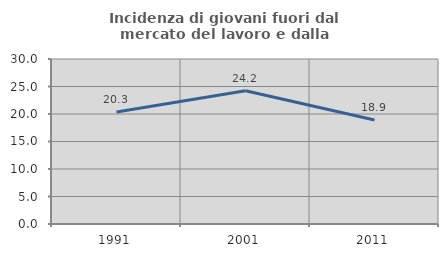
| Category | Incidenza di giovani fuori dal mercato del lavoro e dalla formazione  |
|---|---|
| 1991.0 | 20.346 |
| 2001.0 | 24.222 |
| 2011.0 | 18.895 |